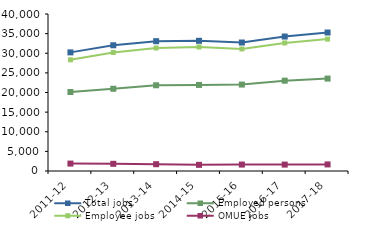
| Category | Total jobs | Employed persons | Employee jobs | OMUE jobs |
|---|---|---|---|---|
| 2011-12 | 30222 | 20127 | 28334 | 1889 |
| 2012-13 | 32033 | 20953 | 30201 | 1829 |
| 2013-14 | 33072 | 21843 | 31342 | 1731 |
| 2014-15 | 33174 | 21927 | 31605 | 1567 |
| 2015-16 | 32734 | 22019 | 31098 | 1636 |
| 2016-17 | 34256 | 23008 | 32625 | 1631 |
| 2017-18 | 35284 | 23545 | 33605 | 1677 |